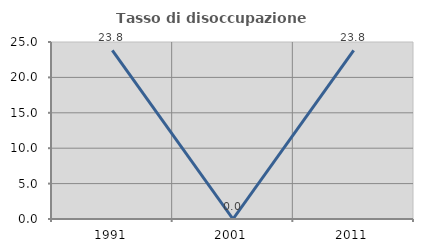
| Category | Tasso di disoccupazione giovanile  |
|---|---|
| 1991.0 | 23.81 |
| 2001.0 | 0 |
| 2011.0 | 23.81 |